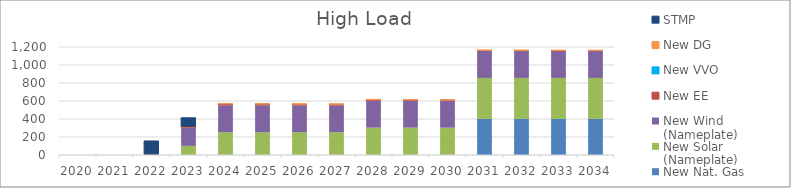
| Category | New Nat. Gas | New Solar (Nameplate) | New Wind (Nameplate) | New EE | New VVO | New DG | STMP |
|---|---|---|---|---|---|---|---|
| 2020.0 | 0 | 0 | 0 | 0 | 0 | 0 | 0 |
| 2021.0 | 0 | 0 | 0 | 0 | 0 | 0 | 0 |
| 2022.0 | 0 | 0 | 0 | 5.943 | 0 | 0 | 150 |
| 2023.0 | 0 | 101.198 | 200 | 11.193 | 0 | 1.022 | 100 |
| 2024.0 | 0 | 252.994 | 300 | 14.303 | 0 | 1.533 | 0 |
| 2025.0 | 0 | 252.994 | 300 | 12.984 | 0 | 1.533 | 0 |
| 2026.0 | 0 | 252.994 | 300 | 11.569 | 0 | 1.533 | 0 |
| 2027.0 | 0 | 252.994 | 300 | 10.183 | 0 | 2.044 | 0 |
| 2028.0 | 0 | 303.593 | 300 | 8.671 | 0 | 2.044 | 0 |
| 2029.0 | 0 | 303.593 | 300 | 7.034 | 0 | 2.555 | 0 |
| 2030.0 | 0 | 303.593 | 300 | 5.493 | 0 | 3.066 | 0 |
| 2031.0 | 401 | 455.389 | 300 | 4.097 | 0 | 3.577 | 0 |
| 2032.0 | 401 | 455.389 | 300 | 2.785 | 0 | 3.577 | 0 |
| 2033.0 | 401 | 455.389 | 300 | 1.771 | 0 | 4.088 | 0 |
| 2034.0 | 401 | 455.389 | 300 | 0.977 | 0 | 4.599 | 0 |